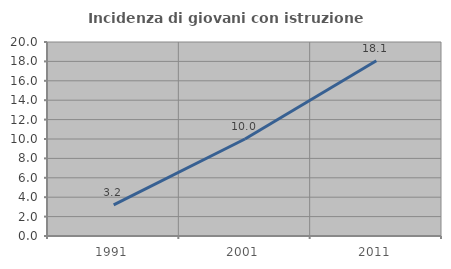
| Category | Incidenza di giovani con istruzione universitaria |
|---|---|
| 1991.0 | 3.209 |
| 2001.0 | 10 |
| 2011.0 | 18.069 |